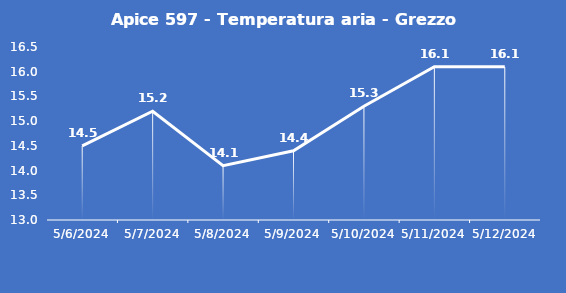
| Category | Apice 597 - Temperatura aria - Grezzo (°C) |
|---|---|
| 5/6/24 | 14.5 |
| 5/7/24 | 15.2 |
| 5/8/24 | 14.1 |
| 5/9/24 | 14.4 |
| 5/10/24 | 15.3 |
| 5/11/24 | 16.1 |
| 5/12/24 | 16.1 |